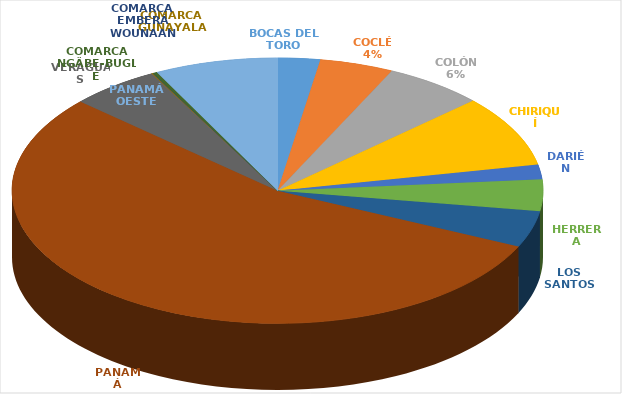
| Category | Cantidad  |
|---|---|
| BOCAS DEL TORO | 152 |
| COCLÉ | 265 |
| COLÓN | 358 |
| CHIRIQUÍ | 513 |
| DARIÉN | 106 |
| HERRERA | 227 |
| LOS SANTOS | 261 |
| PANAMÁ | 3230 |
| VERAGUAS | 321 |
| COMARCA GUNAYALA | 5 |
| COMARCA EMBERÁ WOUNAAN | 1 |
| COMARCA NGÄBE-BUGLÉ | 15 |
| PANAMÁ OESTE | 442 |